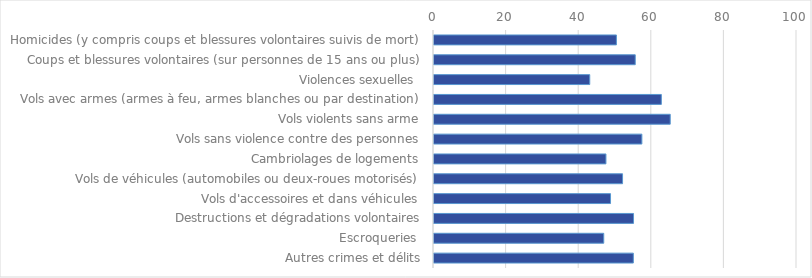
| Category | Series 0 |
|---|---|
| Homicides (y compris coups et blessures volontaires suivis de mort) | 50.251 |
| Coups et blessures volontaires (sur personnes de 15 ans ou plus) | 55.438 |
| Violences sexuelles  | 42.906 |
| Vols avec armes (armes à feu, armes blanches ou par destination) | 62.629 |
| Vols violents sans arme | 65.076 |
| Vols sans violence contre des personnes | 57.263 |
| Cambriolages de logements | 47.369 |
| Vols de véhicules (automobiles ou deux-roues motorisés) | 51.944 |
| Vols d'accessoires et dans véhicules | 48.63 |
| Destructions et dégradations volontaires | 54.965 |
| Escroqueries  | 46.761 |
| Autres crimes et délits | 54.915 |